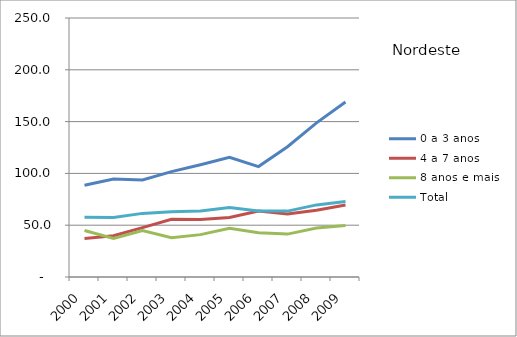
| Category | 0 a 3 anos | 4 a 7 anos | 8 anos e mais | Total |
|---|---|---|---|---|
| 2000.0 | 88.6 | 37.1 | 44.9 | 57.7 |
| 2001.0 | 94.6 | 39.8 | 37.1 | 57.4 |
| 2002.0 | 93.7 | 47.7 | 44.9 | 61.4 |
| 2003.0 | 101.7 | 55.7 | 38 | 63 |
| 2004.0 | 108.4 | 55.6 | 40.9 | 63.7 |
| 2005.0 | 115.6 | 57.4 | 47.1 | 67 |
| 2006.0 | 106.6 | 63.6 | 42.8 | 63.6 |
| 2007.0 | 125.7 | 60.8 | 41.4 | 63.6 |
| 2008.0 | 148.8 | 64.4 | 47.3 | 69.6 |
| 2009.0 | 168.9 | 69.4 | 49.7 | 72.9 |